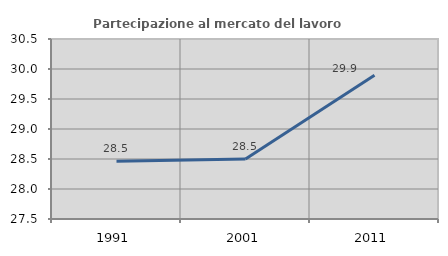
| Category | Partecipazione al mercato del lavoro  femminile |
|---|---|
| 1991.0 | 28.462 |
| 2001.0 | 28.499 |
| 2011.0 | 29.896 |